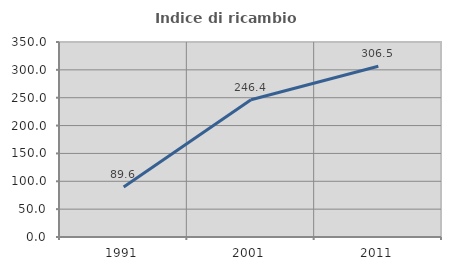
| Category | Indice di ricambio occupazionale  |
|---|---|
| 1991.0 | 89.552 |
| 2001.0 | 246.429 |
| 2011.0 | 306.452 |